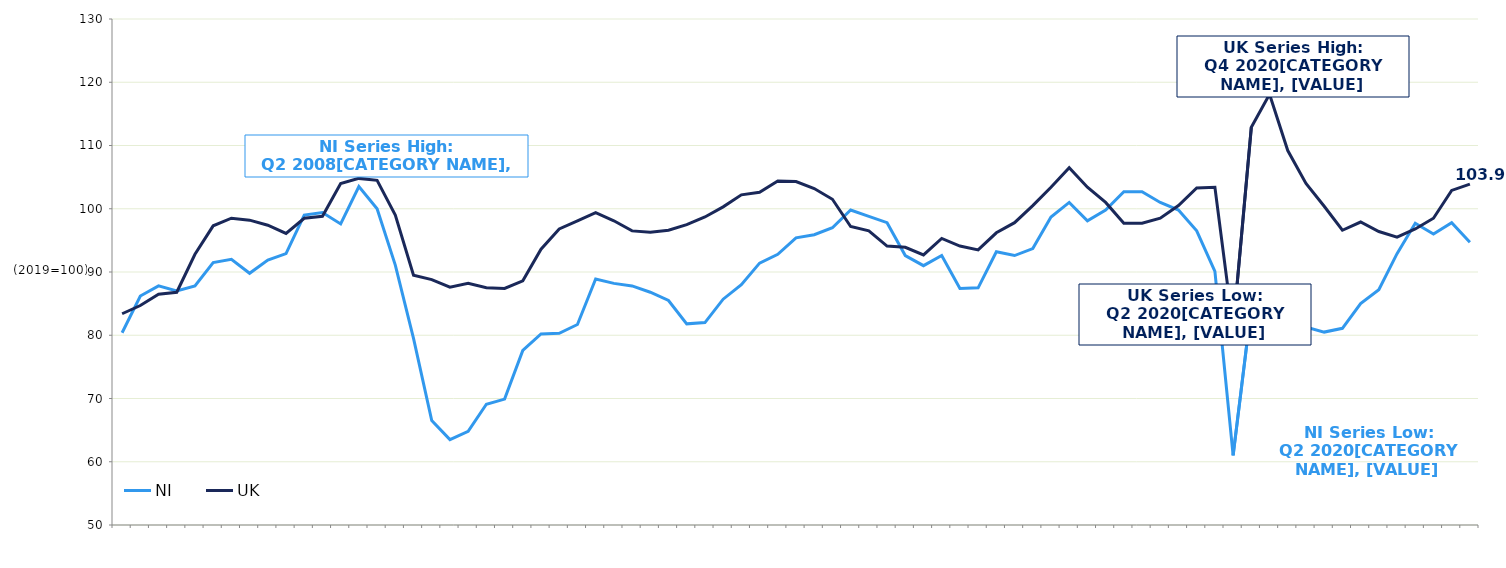
| Category | NI | UK  |
|---|---|---|
|  | 80.4 | 83.4 |
|  | 86.2 | 84.7 |
| Q3 2005 | 87.8 | 86.5 |
|  | 87 | 86.8 |
|  | 87.8 | 92.8 |
|  | 91.5 | 97.3 |
| Q3 2006 | 92 | 98.5 |
|  | 89.8 | 98.2 |
|  | 91.9 | 97.4 |
|  | 92.9 | 96.1 |
| Q3 2007 | 99 | 98.5 |
|  | 99.4 | 98.8 |
|  | 97.6 | 104 |
|  | 103.5 | 104.8 |
| Q3 2008 | 100 | 104.5 |
|  | 91.1 | 99 |
|  | 79.5 | 89.5 |
|  | 66.5 | 88.8 |
| Q3 2009 | 63.5 | 87.6 |
|  | 64.8 | 88.2 |
|  | 69.1 | 87.5 |
|  | 69.9 | 87.4 |
| Q3 2010 | 77.6 | 88.6 |
|  | 80.2 | 93.6 |
|  | 80.3 | 96.8 |
|  | 81.7 | 98.1 |
| Q3 2011 | 88.9 | 99.4 |
|  | 88.2 | 98.1 |
|  | 87.8 | 96.5 |
|  | 86.8 | 96.3 |
| Q3 2012 | 85.5 | 96.6 |
|  | 81.8 | 97.5 |
|  | 82 | 98.7 |
|  | 85.7 | 100.3 |
| Q3 2013 | 88 | 102.2 |
|  | 91.4 | 102.6 |
|  | 92.8 | 104.4 |
|  | 95.4 | 104.3 |
| Q3 2014 | 95.9 | 103.2 |
|  | 97 | 101.5 |
|  | 99.8 | 97.2 |
|  | 98.8 | 96.5 |
| Q3 2015 | 97.8 | 94.1 |
|  | 92.6 | 93.9 |
|  | 91 | 92.7 |
|  | 92.6 | 95.3 |
| Q3 2016 | 87.4 | 94.1 |
|  | 87.5 | 93.5 |
|  | 93.2 | 96.2 |
|  | 92.6 | 97.8 |
| Q3 2017 | 93.7 | 100.5 |
|  | 98.7 | 103.4 |
|  | 101 | 106.5 |
|  | 98.1 | 103.4 |
| Q3 2018 | 99.8 | 101 |
|  | 102.7 | 97.7 |
|  | 102.7 | 97.7 |
|  | 101 | 98.5 |
| Q3 2019 | 99.8 | 100.5 |
|  | 96.5 | 103.3 |
|  | 90.1 | 103.4 |
|  | 61 | 81.1 |
| Q3 2020 | 84.4 | 112.9 |
|  | 84.3 | 118.1 |
|  | 80.4 | 109.2 |
|  | 81.3 | 104 |
| Q3 2021 | 80.5 | 100.4 |
|  | 81.1 | 96.6 |
|  | 85 | 97.9 |
|  | 87.2 | 96.4 |
| Q3 2022 | 92.9 | 95.5 |
|  | 97.7 | 96.8 |
|  | 96 | 98.5 |
|  | 97.8 | 102.9 |
| Q3 2023 | 94.7 | 103.9 |